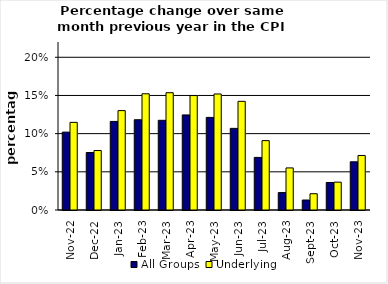
| Category | All Groups | Underlying |
|---|---|---|
| 2022-11-01 | 0.102 | 0.115 |
| 2022-12-01 | 0.075 | 0.078 |
| 2023-01-01 | 0.116 | 0.13 |
| 2023-02-01 | 0.118 | 0.152 |
| 2023-03-01 | 0.117 | 0.154 |
| 2023-04-01 | 0.124 | 0.15 |
| 2023-05-01 | 0.121 | 0.152 |
| 2023-06-01 | 0.107 | 0.142 |
| 2023-07-01 | 0.069 | 0.091 |
| 2023-08-01 | 0.023 | 0.055 |
| 2023-09-01 | 0.013 | 0.021 |
| 2023-10-01 | 0.036 | 0.036 |
| 2023-11-01 | 0.063 | 0.071 |